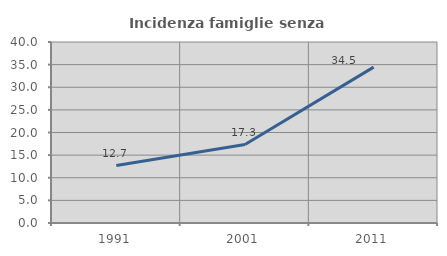
| Category | Incidenza famiglie senza nuclei |
|---|---|
| 1991.0 | 12.697 |
| 2001.0 | 17.345 |
| 2011.0 | 34.455 |